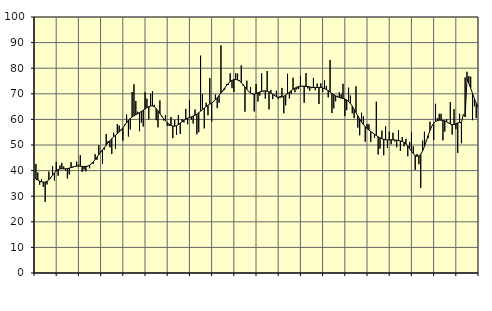
| Category | Piggar | Series 1 |
|---|---|---|
| nan | 42.6 | 36.61 |
| 1.0 | 39.3 | 36.32 |
| 1.0 | 34.5 | 35.89 |
| 1.0 | 36.6 | 35.61 |
| 1.0 | 33.6 | 35.49 |
| 1.0 | 27.8 | 35.54 |
| 1.0 | 34.6 | 35.83 |
| 1.0 | 39.6 | 36.43 |
| 1.0 | 37 | 37.26 |
| 1.0 | 41.7 | 38.2 |
| 1.0 | 36.1 | 39.11 |
| 1.0 | 43.4 | 39.89 |
| nan | 38 | 40.43 |
| 2.0 | 42 | 40.68 |
| 2.0 | 43 | 40.74 |
| 2.0 | 41.6 | 40.71 |
| 2.0 | 40 | 40.7 |
| 2.0 | 36.9 | 40.78 |
| 2.0 | 38.5 | 40.97 |
| 2.0 | 43.3 | 41.2 |
| 2.0 | 41.2 | 41.44 |
| 2.0 | 41.5 | 41.63 |
| 2.0 | 43.5 | 41.75 |
| 2.0 | 42.4 | 41.79 |
| nan | 46 | 41.73 |
| 3.0 | 39.5 | 41.65 |
| 3.0 | 40.4 | 41.6 |
| 3.0 | 39.7 | 41.61 |
| 3.0 | 41.6 | 41.76 |
| 3.0 | 40.9 | 42.11 |
| 3.0 | 43 | 42.67 |
| 3.0 | 42.6 | 43.4 |
| 3.0 | 46.4 | 44.29 |
| 3.0 | 44.2 | 45.27 |
| 3.0 | 49.9 | 46.26 |
| 3.0 | 47.6 | 47.22 |
| nan | 42.7 | 48.16 |
| 4.0 | 48.1 | 49.06 |
| 4.0 | 54.3 | 49.94 |
| 4.0 | 51.5 | 50.81 |
| 4.0 | 49.1 | 51.68 |
| 4.0 | 46.5 | 52.48 |
| 4.0 | 54.8 | 53.2 |
| 4.0 | 48.5 | 53.82 |
| 4.0 | 58.2 | 54.4 |
| 4.0 | 57.6 | 55.03 |
| 4.0 | 56.1 | 55.79 |
| 4.0 | 51.7 | 56.7 |
| nan | 58 | 57.7 |
| 5.0 | 61.9 | 58.7 |
| 5.0 | 53.3 | 59.62 |
| 5.0 | 56.1 | 60.39 |
| 5.0 | 70.7 | 60.98 |
| 5.0 | 73.7 | 61.44 |
| 5.0 | 67.2 | 61.82 |
| 5.0 | 63 | 62.22 |
| 5.0 | 55.4 | 62.66 |
| 5.0 | 58.8 | 63.11 |
| 5.0 | 57.2 | 63.6 |
| 5.0 | 70.6 | 64.1 |
| nan | 68.1 | 64.59 |
| 6.0 | 60 | 64.99 |
| 6.0 | 70 | 65.21 |
| 6.0 | 71 | 65.23 |
| 6.0 | 65.7 | 64.92 |
| 6.0 | 59.7 | 64.28 |
| 6.0 | 56.9 | 63.37 |
| 6.0 | 67.4 | 62.32 |
| 6.0 | 61 | 61.26 |
| 6.0 | 59.6 | 60.3 |
| 6.0 | 61.7 | 59.45 |
| 6.0 | 57.5 | 58.74 |
| nan | 57.4 | 58.12 |
| 7.0 | 60.9 | 57.67 |
| 7.0 | 52.7 | 57.42 |
| 7.0 | 59.8 | 57.35 |
| 7.0 | 54 | 57.52 |
| 7.0 | 61.7 | 57.97 |
| 7.0 | 54.3 | 58.57 |
| 7.0 | 60.1 | 59.14 |
| 7.0 | 58.8 | 59.65 |
| 7.0 | 64.1 | 60.09 |
| 7.0 | 58.1 | 60.48 |
| 7.0 | 67.4 | 60.76 |
| nan | 59.9 | 61.02 |
| 8.0 | 58.4 | 61.3 |
| 8.0 | 63.9 | 61.63 |
| 8.0 | 54.2 | 62.06 |
| 8.0 | 55 | 62.6 |
| 8.0 | 84.9 | 63.21 |
| 8.0 | 69.9 | 63.83 |
| 8.0 | 56.5 | 64.45 |
| 8.0 | 66.5 | 65.02 |
| 8.0 | 61.6 | 65.53 |
| 8.0 | 76.1 | 65.97 |
| 8.0 | 59.2 | 66.41 |
| nan | 67.1 | 66.93 |
| 9.0 | 69.7 | 67.59 |
| 9.0 | 64.4 | 68.39 |
| 9.0 | 66.5 | 69.31 |
| 9.0 | 88.9 | 70.32 |
| 9.0 | 70.9 | 71.3 |
| 9.0 | 71.6 | 72.25 |
| 9.0 | 73.8 | 73.17 |
| 9.0 | 73.5 | 74.05 |
| 9.0 | 78 | 74.77 |
| 9.0 | 72.2 | 75.26 |
| 9.0 | 70.7 | 75.53 |
| nan | 78 | 75.59 |
| 10.0 | 77.9 | 75.41 |
| 10.0 | 75.4 | 75.02 |
| 10.0 | 81.1 | 74.41 |
| 10.0 | 73.1 | 73.6 |
| 10.0 | 63 | 72.68 |
| 10.0 | 75.1 | 71.74 |
| 10.0 | 70.8 | 70.91 |
| 10.0 | 72.6 | 70.29 |
| 10.0 | 70.3 | 69.95 |
| 10.0 | 63.1 | 69.88 |
| 10.0 | 73.8 | 70.06 |
| nan | 67 | 70.39 |
| 11.0 | 69.3 | 70.72 |
| 11.0 | 78 | 70.97 |
| 11.0 | 70.9 | 71.11 |
| 11.0 | 68.1 | 71.13 |
| 11.0 | 78.9 | 71 |
| 11.0 | 63.9 | 70.74 |
| 11.0 | 71.5 | 70.32 |
| 11.0 | 67.9 | 69.81 |
| 11.0 | 69.7 | 69.29 |
| 11.0 | 71.2 | 68.89 |
| 11.0 | 68 | 68.67 |
| nan | 69.1 | 68.62 |
| 12.0 | 72.3 | 68.75 |
| 12.0 | 62.4 | 69.07 |
| 12.0 | 65.5 | 69.5 |
| 12.0 | 77.8 | 70.03 |
| 12.0 | 68.2 | 70.62 |
| 12.0 | 69.9 | 71.21 |
| 12.0 | 76.3 | 71.77 |
| 12.0 | 70.6 | 72.24 |
| 12.0 | 71.7 | 72.58 |
| 12.0 | 71.9 | 72.82 |
| 12.0 | 77 | 72.95 |
| nan | 72.8 | 73 |
| 13.0 | 66.5 | 72.98 |
| 13.0 | 78.1 | 72.9 |
| 13.0 | 72.1 | 72.83 |
| 13.0 | 71.2 | 72.69 |
| 13.0 | 72.2 | 72.52 |
| 13.0 | 76.2 | 72.44 |
| 13.0 | 71.4 | 72.45 |
| 13.0 | 74 | 72.48 |
| 13.0 | 66 | 72.52 |
| 13.0 | 74.1 | 72.47 |
| 13.0 | 70.7 | 72.29 |
| nan | 75.2 | 71.99 |
| 14.0 | 73.1 | 71.64 |
| 14.0 | 68.6 | 71.22 |
| 14.0 | 83.2 | 70.71 |
| 14.0 | 62.5 | 70.18 |
| 14.0 | 64.3 | 69.68 |
| 14.0 | 67.1 | 69.21 |
| 14.0 | 69.2 | 68.8 |
| 14.0 | 70.6 | 68.52 |
| 14.0 | 69.8 | 68.34 |
| 14.0 | 73.9 | 68.19 |
| 14.0 | 61.3 | 67.97 |
| nan | 63.6 | 67.6 |
| 15.0 | 72.4 | 67 |
| 15.0 | 69.3 | 66.17 |
| 15.0 | 62.4 | 65.13 |
| 15.0 | 60.5 | 63.93 |
| 15.0 | 72.9 | 62.66 |
| 15.0 | 56.8 | 61.37 |
| 15.0 | 53.8 | 60.14 |
| 15.0 | 62.6 | 59 |
| 15.0 | 61.2 | 58 |
| 15.0 | 51.3 | 57.13 |
| 15.0 | 58.2 | 56.41 |
| nan | 58.1 | 55.83 |
| 16.0 | 51.2 | 55.29 |
| 16.0 | 54.8 | 54.74 |
| 16.0 | 52.8 | 54.2 |
| 16.0 | 66.9 | 53.7 |
| 16.0 | 46.3 | 53.21 |
| 16.0 | 48.6 | 52.77 |
| 16.0 | 55.6 | 52.44 |
| 16.0 | 46 | 52.22 |
| 16.0 | 57.3 | 52.06 |
| 16.0 | 48.8 | 52 |
| 16.0 | 55.2 | 52.02 |
| nan | 50.3 | 52.03 |
| 17.0 | 54.8 | 52 |
| 17.0 | 51.4 | 51.97 |
| 17.0 | 49.1 | 51.88 |
| 17.0 | 55.8 | 51.74 |
| 17.0 | 47.7 | 51.58 |
| 17.0 | 53.1 | 51.38 |
| 17.0 | 49.5 | 51.02 |
| 17.0 | 52.4 | 50.43 |
| 17.0 | 45.6 | 49.63 |
| 17.0 | 51.2 | 48.63 |
| 17.0 | 54.9 | 47.58 |
| nan | 49.5 | 46.63 |
| 18.0 | 40.3 | 45.93 |
| 18.0 | 46.5 | 45.59 |
| 18.0 | 42.5 | 45.74 |
| 18.0 | 33.2 | 46.41 |
| 18.0 | 51.7 | 47.64 |
| 18.0 | 55.2 | 49.39 |
| 18.0 | 51.9 | 51.47 |
| 18.0 | 52.7 | 53.65 |
| 18.0 | 59.1 | 55.66 |
| 18.0 | 57.3 | 57.34 |
| 18.0 | 52 | 58.51 |
| nan | 66.1 | 59.19 |
| 19.0 | 60.5 | 59.56 |
| 19.0 | 62.2 | 59.69 |
| 19.0 | 62.2 | 59.69 |
| 19.0 | 51.8 | 59.62 |
| 19.0 | 55.2 | 59.43 |
| 19.0 | 60.1 | 59.06 |
| 19.0 | 58.7 | 58.61 |
| 19.0 | 66.8 | 58.2 |
| 19.0 | 54.1 | 57.98 |
| 19.0 | 64 | 58 |
| 19.0 | 56.2 | 58.26 |
| nan | 46.9 | 58.6 |
| 20.0 | 62.2 | 58.81 |
| 20.0 | 50.7 | 58.76 |
| 20.0 | 61.7 | 61.88 |
| 20.0 | 76.4 | 61.05 |
| 20.0 | 78.6 | 75.75 |
| 20.0 | 76.9 | 74.14 |
| 20.0 | 76.7 | 72.23 |
| 20.0 | 59.7 | 70.17 |
| 20.0 | 65.1 | 68.13 |
| 20.0 | 60.5 | 66.33 |
| 20.0 | 64.7 | 64.89 |